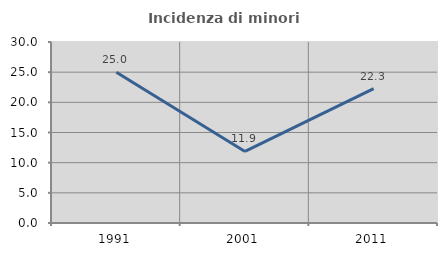
| Category | Incidenza di minori stranieri |
|---|---|
| 1991.0 | 25 |
| 2001.0 | 11.864 |
| 2011.0 | 22.271 |